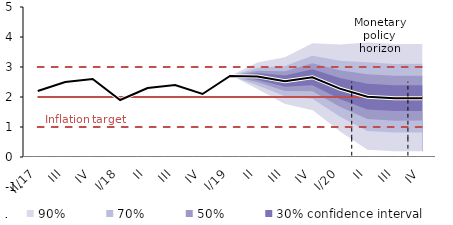
| Category | Inflation Target | Inflation Target - lower bound | Inflation Target - upper bound | linka | Střed předpovědi |
|---|---|---|---|---|---|
| II/17 | 2 | 1 | 3 | 2.2 | 2.2 |
| III | 2 | 1 | 3 | 2.5 | 2.5 |
| IV | 2 | 1 | 3 | 2.6 | 2.6 |
| I/18 | 2 | 1 | 3 | 1.9 | 1.9 |
| II | 2 | 1 | 3 | 2.3 | 2.3 |
| III | 2 | 1 | 3 | 2.4 | 2.4 |
| IV | 2 | 1 | 3 | 2.1 | 2.1 |
| I/19 | 2 | 1 | 3 | 2.7 | 2.7 |
| II | 2 | 1 | 3 | 2.687 | 2.687 |
| III | 2 | 1 | 3 | 2.528 | 2.528 |
| IV | 2 | 1 | 3 | 2.658 | 2.658 |
| I/20 | 2 | 1 | 3 | 2.28 | 2.28 |
| II | 2 | 1 | 3 | 2.011 | 2.011 |
| III | 2 | 1 | 3 | 1.959 | 1.959 |
| IV | 2 | 1 | 3 | 1.962 | 1.962 |